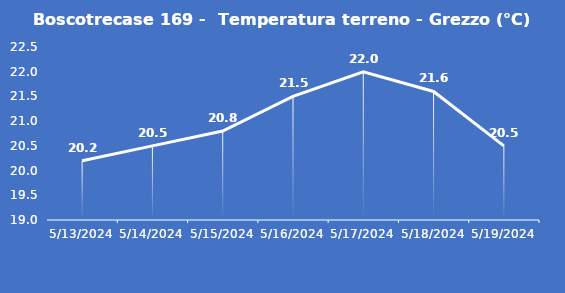
| Category | Boscotrecase 169 -  Temperatura terreno - Grezzo (°C) |
|---|---|
| 5/13/24 | 20.2 |
| 5/14/24 | 20.5 |
| 5/15/24 | 20.8 |
| 5/16/24 | 21.5 |
| 5/17/24 | 22 |
| 5/18/24 | 21.6 |
| 5/19/24 | 20.5 |